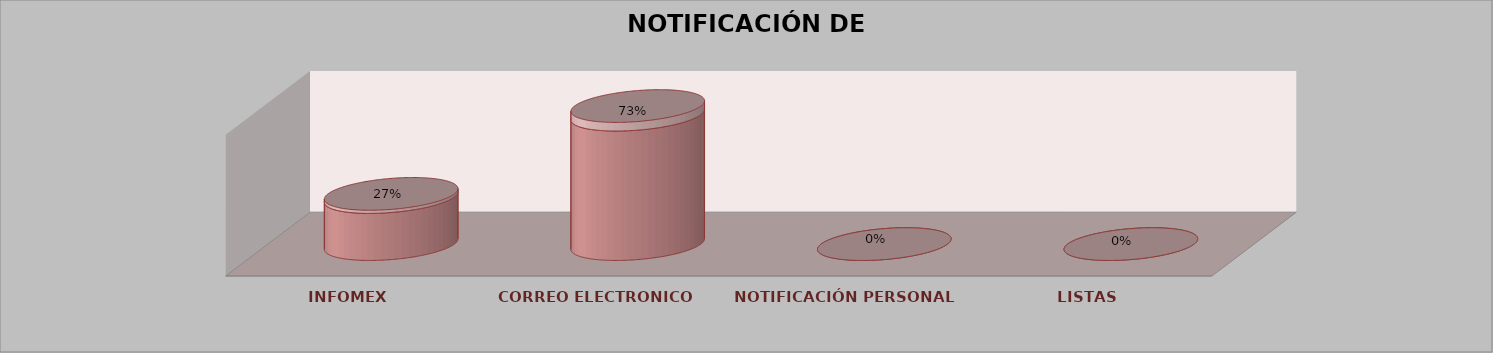
| Category | Series 0 | Series 1 | Series 2 | Series 3 | Series 4 |
|---|---|---|---|---|---|
| INFOMEX |  |  |  | 4 | 0.267 |
| CORREO ELECTRONICO |  |  |  | 11 | 0.733 |
| NOTIFICACIÓN PERSONAL |  |  |  | 0 | 0 |
| LISTAS |  |  |  | 0 | 0 |